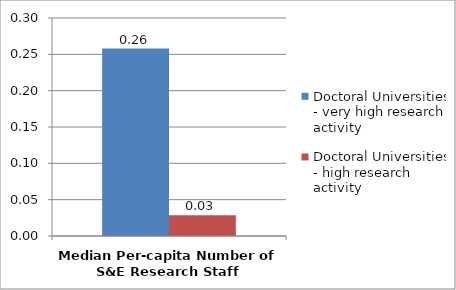
| Category | Doctoral Universities - very high research activity | Doctoral Universities - high research activity |
|---|---|---|
| Median Per-capita Number of S&E Research Staff | 0.258 | 0.029 |